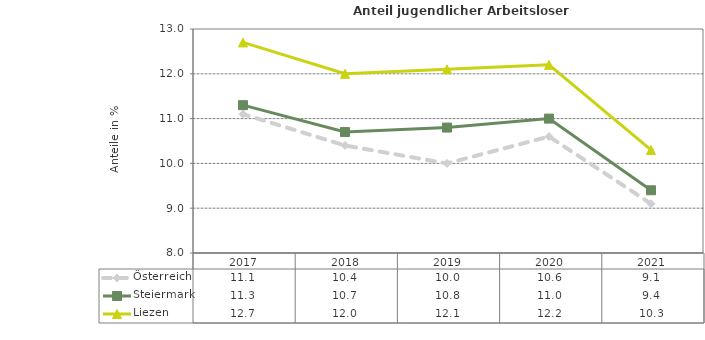
| Category | Österreich | Steiermark | Liezen |
|---|---|---|---|
| 2021.0 | 9.1 | 9.4 | 10.3 |
| 2020.0 | 10.6 | 11 | 12.2 |
| 2019.0 | 10 | 10.8 | 12.1 |
| 2018.0 | 10.4 | 10.7 | 12 |
| 2017.0 | 11.1 | 11.3 | 12.7 |